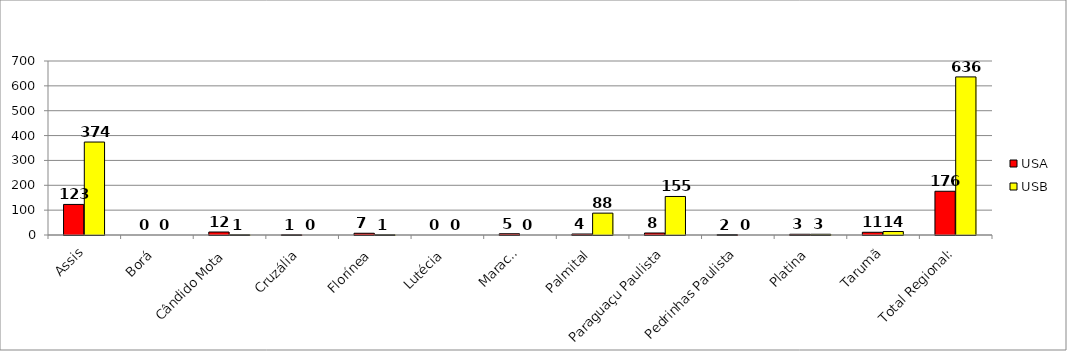
| Category | USA | USB |
|---|---|---|
| Assis | 123 | 374 |
| Borá | 0 | 0 |
| Cândido Mota | 12 | 1 |
| Cruzália | 1 | 0 |
| Florínea | 7 | 1 |
| Lutécia | 0 | 0 |
| Maracaí | 5 | 0 |
| Palmital | 4 | 88 |
| Paraguaçu Paulista | 8 | 155 |
| Pedrinhas Paulista | 2 | 0 |
| Platina | 3 | 3 |
| Tarumã | 11 | 14 |
| Total Regional: | 176 | 636 |